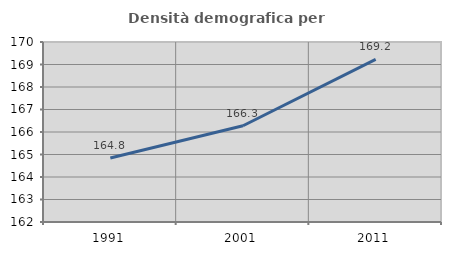
| Category | Densità demografica |
|---|---|
| 1991.0 | 164.844 |
| 2001.0 | 166.279 |
| 2011.0 | 169.224 |